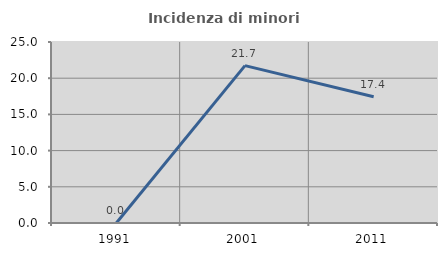
| Category | Incidenza di minori stranieri |
|---|---|
| 1991.0 | 0 |
| 2001.0 | 21.739 |
| 2011.0 | 17.442 |